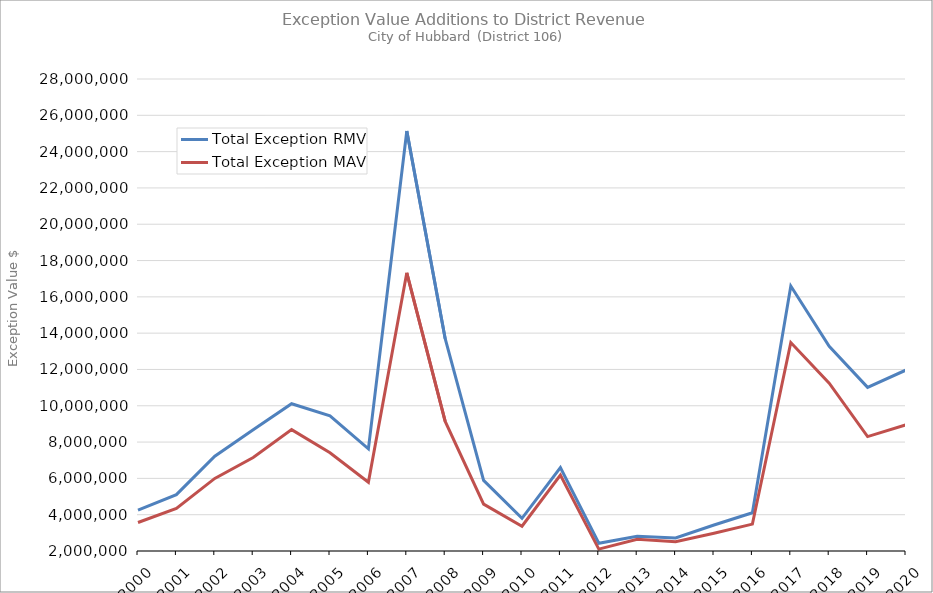
| Category | Total Exception RMV | Total Exception MAV |
|---|---|---|
| 2000.0 | 4246611 | 3571405 |
| 2001.0 | 5102983 | 4351598 |
| 2002.0 | 7218611 | 5999601 |
| 2003.0 | 8677251 | 7150941 |
| 2004.0 | 10113950 | 8686470 |
| 2005.0 | 9449014 | 7412217 |
| 2006.0 | 7625323 | 5783723 |
| 2007.0 | 25133231 | 17322278 |
| 2008.0 | 13697097 | 9139255 |
| 2009.0 | 5891173 | 4584023 |
| 2010.0 | 3799832 | 3363482 |
| 2011.0 | 6598283 | 6180393 |
| 2012.0 | 2425862 | 2104929 |
| 2013.0 | 2814634 | 2647001 |
| 2014.0 | 2722105 | 2511756 |
| 2015.0 | 3432681 | 2973803 |
| 2016.0 | 4108374 | 3480154 |
| 2017.0 | 16596942 | 13483854 |
| 2018.0 | 13274751 | 11244958 |
| 2019.0 | 11014285 | 8303263 |
| 2020.0 | 11968424 | 8950264 |